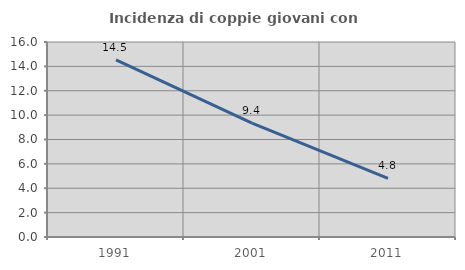
| Category | Incidenza di coppie giovani con figli |
|---|---|
| 1991.0 | 14.542 |
| 2001.0 | 9.351 |
| 2011.0 | 4.812 |